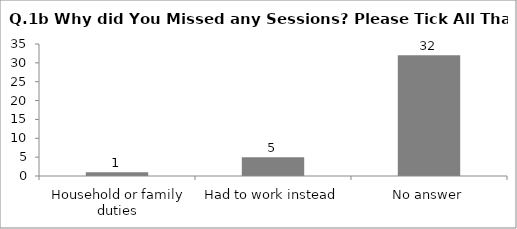
| Category | Q.1b Why did You Missed any Sessions? Please Tick All That Apply |
|---|---|
| Household or family duties | 1 |
| Had to work instead | 5 |
| No answer | 32 |